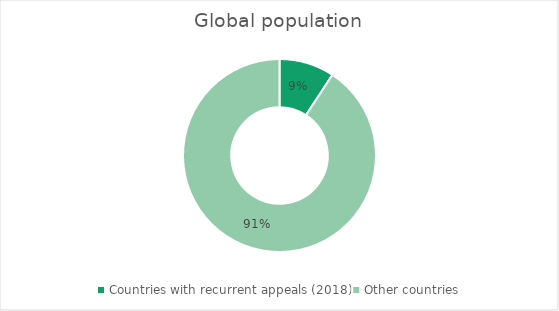
| Category | Global population |
|---|---|
| Countries with recurrent appeals (2018) | 666.927 |
| Other countries | 6546.545 |